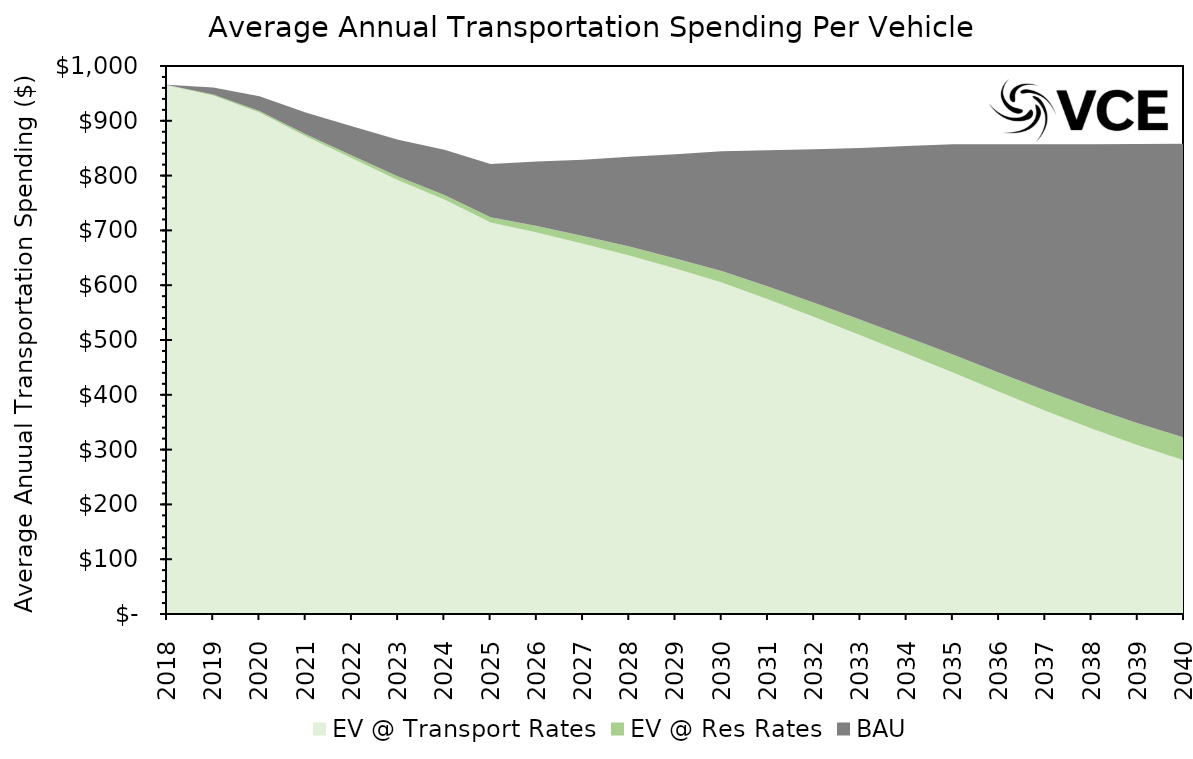
| Category | EV @ Transport Rates | EV @ Res Rates | BAU |
|---|---|---|---|
| 2018.0 | 964.952 | 0.561 | 0.392 |
| 2019.0 | 946.273 | 1.568 | 12.832 |
| 2020.0 | 915.205 | 2.507 | 26.9 |
| 2021.0 | 871.791 | 3.787 | 39.767 |
| 2022.0 | 831.697 | 5.158 | 53.287 |
| 2023.0 | 791.696 | 6.626 | 67.305 |
| 2024.0 | 756.372 | 8.193 | 82.58 |
| 2025.0 | 714.315 | 9.86 | 97.209 |
| 2026.0 | 696.348 | 11.789 | 117.513 |
| 2027.0 | 675.731 | 13.868 | 139.534 |
| 2028.0 | 654.415 | 16.094 | 163.982 |
| 2029.0 | 630.38 | 18.46 | 190.16 |
| 2030.0 | 604.771 | 20.957 | 218.484 |
| 2031.0 | 574.251 | 23.284 | 248.659 |
| 2032.0 | 542.166 | 25.645 | 280.47 |
| 2033.0 | 508.873 | 28.009 | 313.708 |
| 2034.0 | 475.052 | 30.344 | 348.475 |
| 2035.0 | 440.796 | 32.612 | 384.026 |
| 2036.0 | 405.339 | 34.771 | 416.969 |
| 2037.0 | 371.032 | 36.781 | 449.384 |
| 2038.0 | 338.312 | 38.602 | 480.279 |
| 2039.0 | 307.884 | 40.198 | 509.449 |
| 2040.0 | 280.241 | 41.542 | 536.365 |